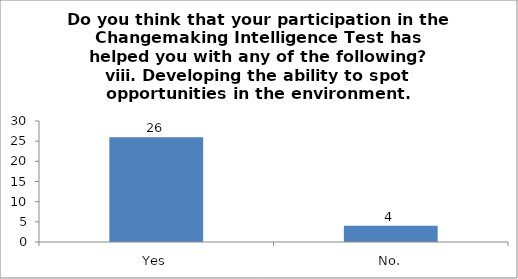
| Category | Do you think that your participation in the Changemaking Intelligence Test has helped you with any of the following?
viii. Developing the ability to spot opportunities in the environment. |
|---|---|
| Yes | 26 |
| No. | 4 |